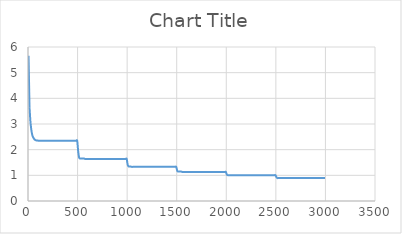
| Category | Series 0 |
|---|---|
| 5.34 | 5.658 |
| 15.34 | 3.628 |
| 25.34 | 3.036 |
| 35.34 | 2.726 |
| 45.35 | 2.542 |
| 55.35 | 2.458 |
| 65.35 | 2.401 |
| 75.35 | 2.373 |
| 85.33 | 2.359 |
| 95.33 | 2.359 |
| 105.34 | 2.345 |
| 115.35 | 2.345 |
| 125.34 | 2.345 |
| 135.34 | 2.345 |
| 145.34 | 2.345 |
| 155.33 | 2.345 |
| 165.34 | 2.345 |
| 175.34 | 2.345 |
| 185.36 | 2.345 |
| 195.36 | 2.345 |
| 205.36 | 2.345 |
| 215.34 | 2.345 |
| 225.34 | 2.345 |
| 235.33 | 2.345 |
| 245.33 | 2.345 |
| 255.34 | 2.345 |
| 265.34 | 2.345 |
| 275.36 | 2.345 |
| 285.34 | 2.345 |
| 295.34 | 2.345 |
| 305.34 | 2.345 |
| 315.34 | 2.345 |
| 325.34 | 2.345 |
| 335.34 | 2.345 |
| 345.33 | 2.345 |
| 355.33 | 2.345 |
| 365.33 | 2.345 |
| 375.33 | 2.345 |
| 385.33 | 2.345 |
| 395.33 | 2.345 |
| 405.34 | 2.345 |
| 415.34 | 2.345 |
| 425.34 | 2.345 |
| 435.33 | 2.345 |
| 445.33 | 2.345 |
| 455.33 | 2.345 |
| 465.33 | 2.345 |
| 475.33 | 2.345 |
| 485.33 | 2.345 |
| 496.33 | 2.345 |
| 505.34 | 1.964 |
| 515.37 | 1.696 |
| 525.34 | 1.654 |
| 535.32 | 1.654 |
| 545.34 | 1.654 |
| 555.34 | 1.654 |
| 565.34 | 1.654 |
| 575.33 | 1.64 |
| 585.33 | 1.64 |
| 595.33 | 1.64 |
| 605.33 | 1.64 |
| 615.33 | 1.64 |
| 625.33 | 1.64 |
| 635.33 | 1.64 |
| 645.33 | 1.64 |
| 655.34 | 1.64 |
| 665.34 | 1.64 |
| 675.34 | 1.64 |
| 685.33 | 1.64 |
| 695.36 | 1.64 |
| 705.32 | 1.64 |
| 715.33 | 1.64 |
| 725.32 | 1.64 |
| 735.32 | 1.64 |
| 745.32 | 1.64 |
| 755.33 | 1.64 |
| 765.33 | 1.64 |
| 775.33 | 1.64 |
| 785.32 | 1.64 |
| 795.33 | 1.64 |
| 805.33 | 1.64 |
| 815.33 | 1.64 |
| 825.34 | 1.64 |
| 835.32 | 1.64 |
| 845.32 | 1.64 |
| 855.33 | 1.64 |
| 865.33 | 1.64 |
| 875.33 | 1.64 |
| 885.32 | 1.64 |
| 895.33 | 1.64 |
| 905.32 | 1.64 |
| 915.33 | 1.64 |
| 925.32 | 1.64 |
| 935.32 | 1.64 |
| 945.33 | 1.64 |
| 955.32 | 1.64 |
| 965.34 | 1.64 |
| 975.32 | 1.64 |
| 985.32 | 1.64 |
| 995.32 | 1.64 |
| 1005.33 | 1.414 |
| 1015.33 | 1.344 |
| 1025.33 | 1.344 |
| 1035.32 | 1.344 |
| 1045.32 | 1.33 |
| 1055.32 | 1.33 |
| 1065.32 | 1.33 |
| 1075.32 | 1.33 |
| 1085.33 | 1.33 |
| 1095.33 | 1.33 |
| 1105.33 | 1.33 |
| 1115.32 | 1.33 |
| 1125.32 | 1.33 |
| 1135.31 | 1.33 |
| 1145.32 | 1.33 |
| 1155.32 | 1.33 |
| 1165.32 | 1.33 |
| 1175.32 | 1.33 |
| 1185.32 | 1.33 |
| 1195.33 | 1.33 |
| 1205.32 | 1.33 |
| 1215.32 | 1.33 |
| 1225.32 | 1.33 |
| 1235.32 | 1.33 |
| 1245.32 | 1.33 |
| 1255.34 | 1.33 |
| 1265.32 | 1.33 |
| 1275.32 | 1.33 |
| 1285.32 | 1.33 |
| 1295.31 | 1.33 |
| 1305.31 | 1.33 |
| 1315.34 | 1.33 |
| 1325.31 | 1.33 |
| 1335.32 | 1.33 |
| 1345.32 | 1.33 |
| 1355.32 | 1.33 |
| 1365.31 | 1.33 |
| 1375.31 | 1.33 |
| 1385.31 | 1.33 |
| 1395.31 | 1.33 |
| 1405.31 | 1.33 |
| 1415.31 | 1.33 |
| 1425.31 | 1.33 |
| 1435.32 | 1.33 |
| 1445.32 | 1.33 |
| 1455.31 | 1.33 |
| 1465.31 | 1.33 |
| 1475.31 | 1.33 |
| 1485.31 | 1.33 |
| 1495.31 | 1.33 |
| 1505.32 | 1.175 |
| 1515.32 | 1.147 |
| 1525.32 | 1.147 |
| 1535.32 | 1.147 |
| 1545.32 | 1.147 |
| 1555.31 | 1.132 |
| 1565.32 | 1.132 |
| 1575.31 | 1.132 |
| 1585.32 | 1.132 |
| 1595.33 | 1.132 |
| 1605.31 | 1.132 |
| 1615.31 | 1.132 |
| 1625.32 | 1.132 |
| 1635.31 | 1.132 |
| 1645.32 | 1.132 |
| 1655.33 | 1.132 |
| 1665.32 | 1.132 |
| 1675.3 | 1.132 |
| 1685.31 | 1.132 |
| 1705.32 | 1.132 |
| 1715.32 | 1.132 |
| 1725.3 | 1.132 |
| 1735.31 | 1.132 |
| 1745.31 | 1.132 |
| 1755.31 | 1.132 |
| 1765.3 | 1.132 |
| 1775.31 | 1.132 |
| 1785.31 | 1.132 |
| 1795.3 | 1.132 |
| 1805.31 | 1.132 |
| 1815.33 | 1.132 |
| 1825.33 | 1.132 |
| 1835.32 | 1.132 |
| 1845.31 | 1.132 |
| 1855.31 | 1.132 |
| 1865.31 | 1.132 |
| 1875.31 | 1.132 |
| 1885.31 | 1.132 |
| 1895.3 | 1.132 |
| 1905.3 | 1.132 |
| 1915.3 | 1.132 |
| 1925.31 | 1.132 |
| 1935.31 | 1.132 |
| 1945.31 | 1.132 |
| 1955.3 | 1.132 |
| 1965.3 | 1.132 |
| 1975.3 | 1.132 |
| 1985.31 | 1.132 |
| 1995.31 | 1.132 |
| 2005.3 | 1.034 |
| 2015.3 | 1.006 |
| 2025.3 | 1.006 |
| 2035.31 | 1.006 |
| 2045.3 | 1.006 |
| 2055.31 | 1.006 |
| 2065.29 | 1.006 |
| 2075.3 | 1.006 |
| 2085.3 | 1.006 |
| 2095.3 | 1.006 |
| 2105.31 | 1.006 |
| 2115.3 | 1.006 |
| 2125.3 | 1.006 |
| 2135.3 | 1.006 |
| 2145.32 | 1.006 |
| 2155.31 | 1.006 |
| 2165.3 | 1.006 |
| 2175.3 | 1.006 |
| 2185.3 | 1.006 |
| 2195.3 | 1.006 |
| 2205.31 | 1.006 |
| 2215.3 | 1.006 |
| 2225.3 | 1.006 |
| 2235.3 | 1.006 |
| 2245.3 | 1.006 |
| 2255.31 | 1.006 |
| 2265.29 | 1.006 |
| 2275.29 | 1.006 |
| 2285.3 | 1.006 |
| 2295.3 | 1.006 |
| 2305.3 | 1.006 |
| 2315.3 | 1.006 |
| 2325.3 | 1.006 |
| 2335.29 | 1.006 |
| 2345.29 | 1.006 |
| 2355.29 | 1.006 |
| 2365.3 | 1.006 |
| 2375.3 | 1.006 |
| 2385.29 | 1.006 |
| 2395.31 | 1.006 |
| 2405.29 | 1.006 |
| 2415.29 | 1.006 |
| 2425.29 | 1.006 |
| 2435.31 | 1.006 |
| 2445.3 | 1.006 |
| 2455.3 | 1.006 |
| 2465.3 | 1.006 |
| 2475.3 | 1.006 |
| 2485.3 | 1.006 |
| 2495.3 | 1.006 |
| 2505.29 | 0.935 |
| 2515.31 | 0.893 |
| 2525.31 | 0.893 |
| 2535.29 | 0.893 |
| 2545.29 | 0.893 |
| 2555.29 | 0.893 |
| 2565.29 | 0.893 |
| 2575.29 | 0.893 |
| 2585.31 | 0.893 |
| 2595.3 | 0.893 |
| 2605.3 | 0.893 |
| 2615.29 | 0.893 |
| 2625.29 | 0.893 |
| 2635.28 | 0.893 |
| 2645.28 | 0.893 |
| 2655.29 | 0.893 |
| 2665.29 | 0.893 |
| 2675.29 | 0.893 |
| 2685.29 | 0.893 |
| 2695.28 | 0.893 |
| 2705.28 | 0.893 |
| 2715.29 | 0.893 |
| 2725.29 | 0.893 |
| 2735.28 | 0.893 |
| 2745.28 | 0.893 |
| 2755.29 | 0.893 |
| 2765.3 | 0.893 |
| 2775.31 | 0.893 |
| 2785.28 | 0.893 |
| 2795.29 | 0.893 |
| 2805.29 | 0.893 |
| 2815.29 | 0.893 |
| 2825.29 | 0.893 |
| 2835.29 | 0.893 |
| 2845.29 | 0.893 |
| 2855.29 | 0.893 |
| 2865.29 | 0.893 |
| 2875.29 | 0.893 |
| 2885.29 | 0.893 |
| 2895.29 | 0.893 |
| 2905.29 | 0.893 |
| 2915.29 | 0.893 |
| 2925.29 | 0.893 |
| 2935.28 | 0.893 |
| 2945.28 | 0.893 |
| 2955.28 | 0.893 |
| 2965.28 | 0.893 |
| 2975.28 | 0.893 |
| 2985.28 | 0.893 |
| 2995.29 | 0.893 |